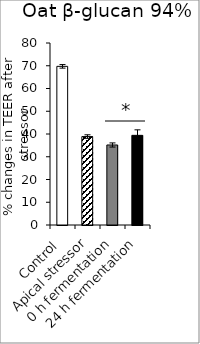
| Category | average |
|---|---|
| Control | 69.735 |
| Apical stressor | 38.871 |
| 0 h fermentation | 35.173 |
| 24 h fermentation | 39.407 |